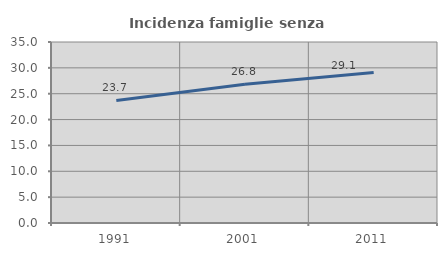
| Category | Incidenza famiglie senza nuclei |
|---|---|
| 1991.0 | 23.702 |
| 2001.0 | 26.823 |
| 2011.0 | 29.09 |